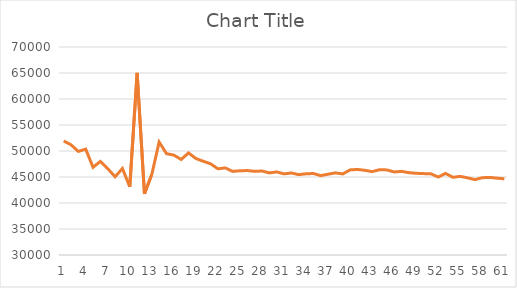
| Category | Series 0 |
|---|---|
| 0 | 51931.1 |
| 1 | 51194.5 |
| 2 | 49915.8 |
| 3 | 50357.9 |
| 4 | 46869.9 |
| 5 | 47992.9 |
| 6 | 46597.4 |
| 7 | 45048.9 |
| 8 | 46643.6 |
| 9 | 43112.9 |
| 10 | 65020.9 |
| 11 | 41764 |
| 12 | 45503.4 |
| 13 | 51719.2 |
| 14 | 49490.4 |
| 15 | 49211.6 |
| 16 | 48371.9 |
| 17 | 49632.9 |
| 18 | 48558 |
| 19 | 48028.7 |
| 20 | 47539.3 |
| 21 | 46572.6 |
| 22 | 46749.4 |
| 23 | 46080.7 |
| 24 | 46192 |
| 25 | 46242.9 |
| 26 | 46084.9 |
| 27 | 46153.8 |
| 28 | 45786.4 |
| 29 | 45981.5 |
| 30 | 45600.5 |
| 31 | 45774.7 |
| 32 | 45454.1 |
| 33 | 45615.6 |
| 34 | 45669.7 |
| 35 | 45263.3 |
| 36 | 45539.3 |
| 37 | 45796.5 |
| 38 | 45591.4 |
| 39 | 46362.3 |
| 40 | 46455.9 |
| 41 | 46289.8 |
| 42 | 46033.6 |
| 43 | 46394.9 |
| 44 | 46364.1 |
| 45 | 45969.4 |
| 46 | 46088.9 |
| 47 | 45831.3 |
| 48 | 45713.1 |
| 49 | 45652.2 |
| 50 | 45615.7 |
| 51 | 44995.5 |
| 52 | 45684.9 |
| 53 | 44941.4 |
| 54 | 45122.1 |
| 55 | 44832.8 |
| 56 | 44490.3 |
| 57 | 44862.8 |
| 58 | 44926.1 |
| 59 | 44782.2 |
| 60 | 44646.1 |